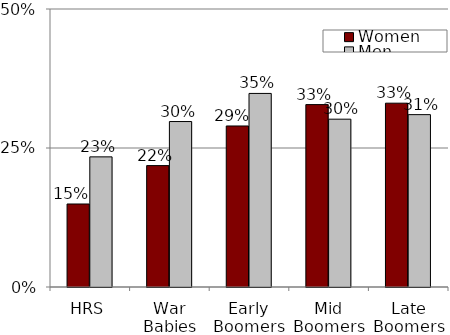
| Category | Women | Men |
|---|---|---|
| HRS | 0.149 | 0.234 |
| War Babies | 0.218 | 0.298 |
| Early Boomers | 0.29 | 0.348 |
| Mid Boomers | 0.328 | 0.302 |
| Late Boomers | 0.331 | 0.31 |